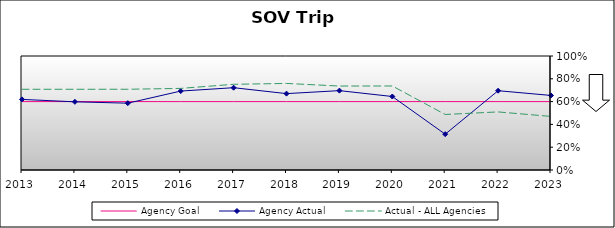
| Category | Agency Goal | Agency Actual | Actual - ALL Agencies |
|---|---|---|---|
| 2013.0 | 0.6 | 0.619 | 0.708 |
| 2014.0 | 0.6 | 0.598 | 0.708 |
| 2015.0 | 0.6 | 0.586 | 0.708 |
| 2016.0 | 0.6 | 0.692 | 0.716 |
| 2017.0 | 0.6 | 0.722 | 0.752 |
| 2018.0 | 0.6 | 0.67 | 0.759 |
| 2019.0 | 0.6 | 0.696 | 0.736 |
| 2020.0 | 0.6 | 0.645 | 0.737 |
| 2021.0 | 0.6 | 0.314 | 0.487 |
| 2022.0 | 0.6 | 0.696 | 0.509 |
| 2023.0 | 0.6 | 0.654 | 0.47 |